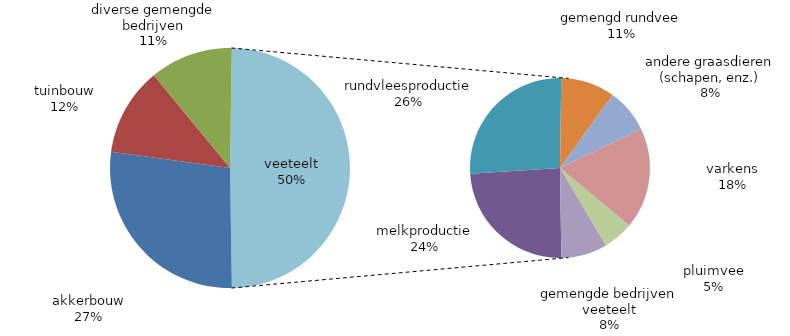
| Category | Series 0 |
|---|---|
| akkerbouw | 6399 |
| tuinbouw | 2783 |
| diverse gemengde bedrijven | 2612 |
| melkproductie | 2802 |
| rundvleesproductie | 3035 |
| gemengd rundvee | 1124 |
| andere graasdieren (schapen, enz.) | 915 |
| varkens | 2106 |
| pluimvee | 627 |
| gemengde bedrijven veeteelt | 958 |